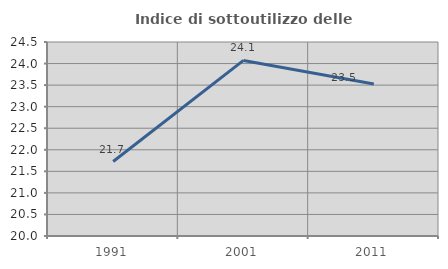
| Category | Indice di sottoutilizzo delle abitazioni  |
|---|---|
| 1991.0 | 21.728 |
| 2001.0 | 24.073 |
| 2011.0 | 23.524 |